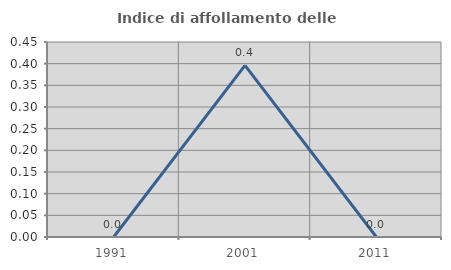
| Category | Indice di affollamento delle abitazioni  |
|---|---|
| 1991.0 | 0 |
| 2001.0 | 0.396 |
| 2011.0 | 0 |